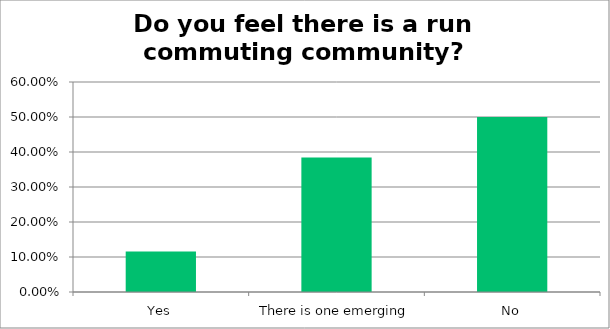
| Category | Responses |
|---|---|
| Yes | 0.115 |
| There is one emerging | 0.385 |
| No | 0.5 |